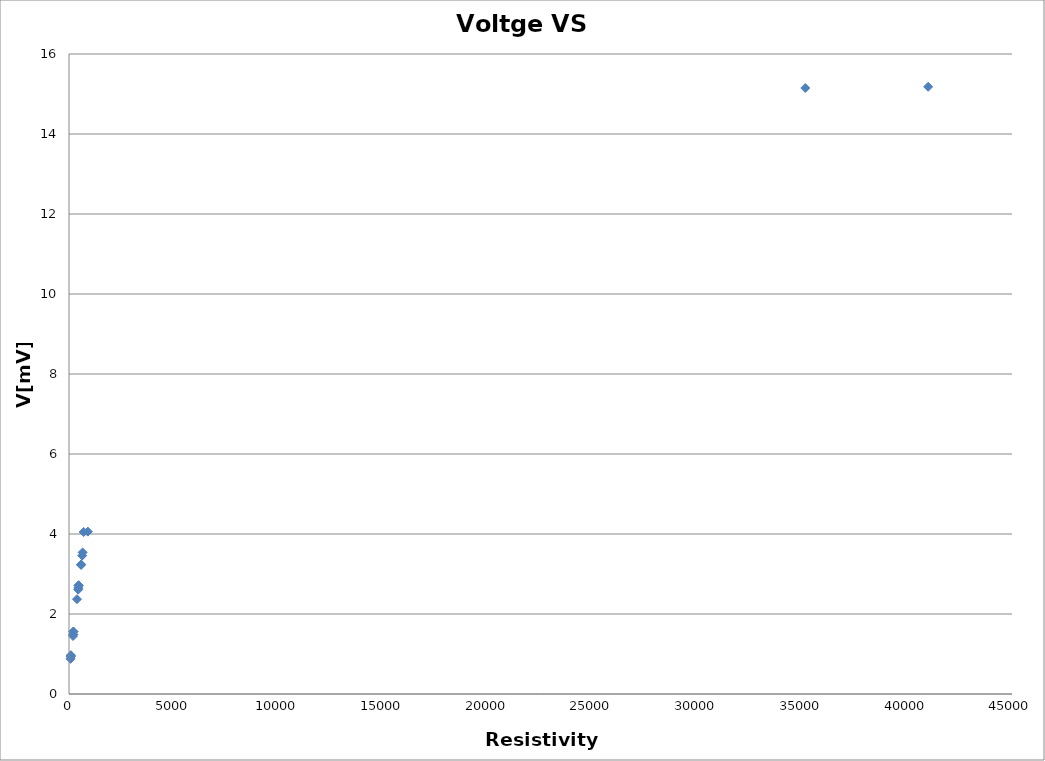
| Category | Series 0 |
|---|---|
| 73.0 | 0.88 |
| 86.0 | 0.93 |
| 89.0 | 0.95 |
| 90.0 | 0.97 |
| 191.0 | 1.45 |
| 197.0 | 1.49 |
| 197.0 | 1.49 |
| 210.0 | 1.56 |
| 210.0 | 1.56 |
| 380.0 | 2.37 |
| 438.0 | 2.61 |
| 444.0 | 2.65 |
| 460.0 | 2.71 |
| 459.0 | 2.72 |
| 575.0 | 3.226 |
| 579.0 | 3.24 |
| 630.0 | 3.46 |
| 650.0 | 3.54 |
| 700.0 | 4.05 |
| 900.0 | 4.059 |
| 35135.0 | 15.15 |
| 41000.0 | 15.18 |